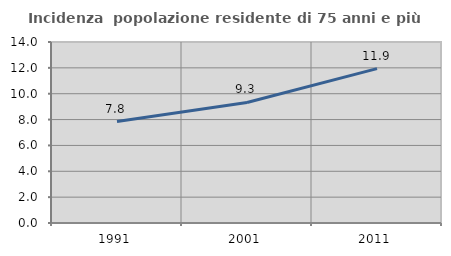
| Category | Incidenza  popolazione residente di 75 anni e più |
|---|---|
| 1991.0 | 7.848 |
| 2001.0 | 9.326 |
| 2011.0 | 11.938 |